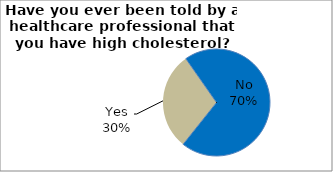
| Category | Series 0 |
|---|---|
| No | 70.44 |
| Yes | 29.56 |